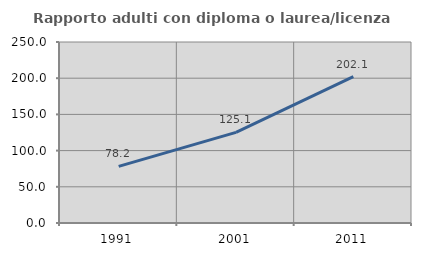
| Category | Rapporto adulti con diploma o laurea/licenza media  |
|---|---|
| 1991.0 | 78.189 |
| 2001.0 | 125.097 |
| 2011.0 | 202.105 |